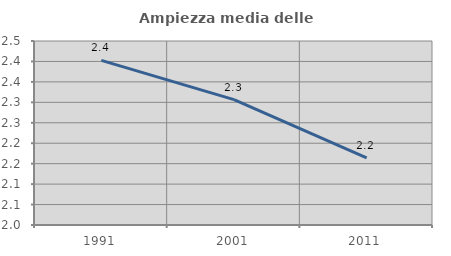
| Category | Ampiezza media delle famiglie |
|---|---|
| 1991.0 | 2.402 |
| 2001.0 | 2.307 |
| 2011.0 | 2.164 |